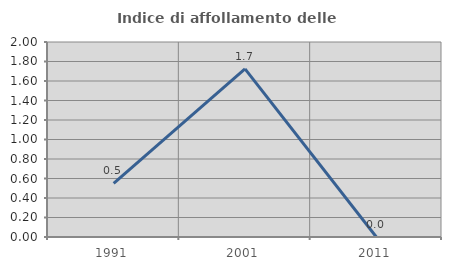
| Category | Indice di affollamento delle abitazioni  |
|---|---|
| 1991.0 | 0.549 |
| 2001.0 | 1.724 |
| 2011.0 | 0 |